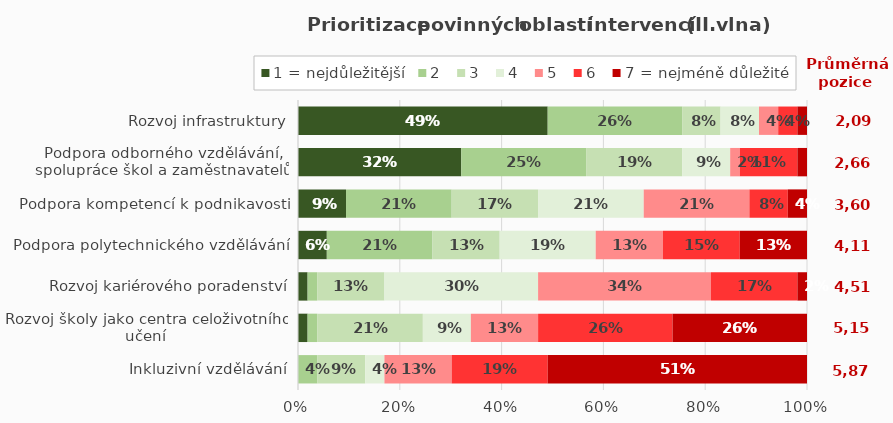
| Category | 1 = nejdůležitější | 2 | 3 | 4 | 5 | 6 | 7 = nejméně důležité |
|---|---|---|---|---|---|---|---|
| Rozvoj infrastruktury | 0.491 | 0.264 | 0.075 | 0.075 | 0.038 | 0.038 | 0.019 |
| Podpora odborného vzdělávání, spolupráce škol a zaměstnavatelů | 0.321 | 0.245 | 0.189 | 0.094 | 0.019 | 0.113 | 0.019 |
| Podpora kompetencí k podnikavosti | 0.094 | 0.208 | 0.17 | 0.208 | 0.208 | 0.075 | 0.038 |
| Podpora polytechnického vzdělávání | 0.057 | 0.208 | 0.132 | 0.189 | 0.132 | 0.151 | 0.132 |
| Rozvoj kariérového poradenství | 0.019 | 0.019 | 0.132 | 0.302 | 0.34 | 0.17 | 0.019 |
| Rozvoj školy jako centra celoživotního učení | 0.019 | 0.019 | 0.208 | 0.094 | 0.132 | 0.264 | 0.264 |
| Inkluzivní vzdělávání | 0 | 0.038 | 0.094 | 0.038 | 0.132 | 0.189 | 0.509 |